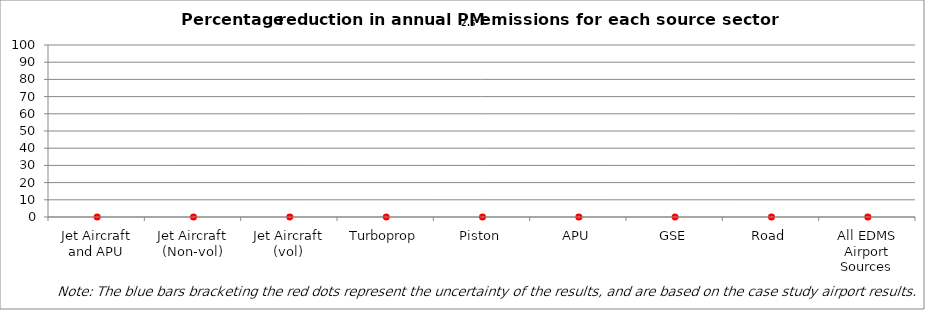
| Category | Series 0 | Series 1 | Series 2 |
|---|---|---|---|
| Jet Aircraft and APU | 0 | 0 | 0 |
| Jet Aircraft (Non-vol) | 0 | 0 | 0 |
| Jet Aircraft (vol) | 0 | 0 | 0 |
| Turboprop | 0 | 0 | 0 |
| Piston | 0 | 0 | 0 |
| APU | 0 | 0 | 0 |
| GSE | 0 | 0 | 0 |
| Road | 0 | 0 | 0 |
| All EDMS Airport Sources | 0 | 0 | 0 |